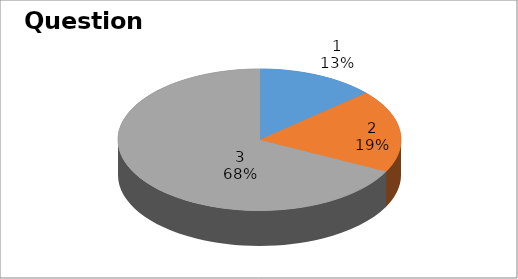
| Category | Series 0 |
|---|---|
| 0 | 5 |
| 1 | 7 |
| 2 | 25 |